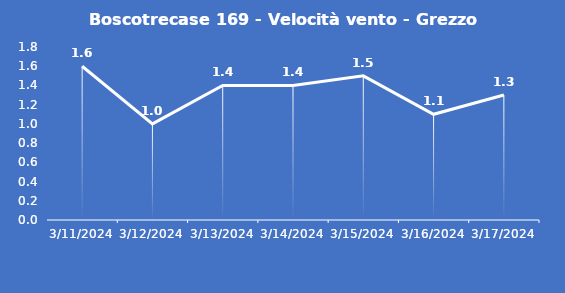
| Category | Boscotrecase 169 - Velocità vento - Grezzo (m/s) |
|---|---|
| 3/11/24 | 1.6 |
| 3/12/24 | 1 |
| 3/13/24 | 1.4 |
| 3/14/24 | 1.4 |
| 3/15/24 | 1.5 |
| 3/16/24 | 1.1 |
| 3/17/24 | 1.3 |